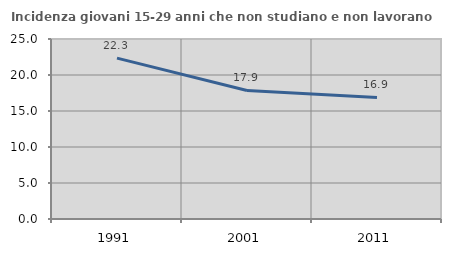
| Category | Incidenza giovani 15-29 anni che non studiano e non lavorano  |
|---|---|
| 1991.0 | 22.342 |
| 2001.0 | 17.857 |
| 2011.0 | 16.883 |